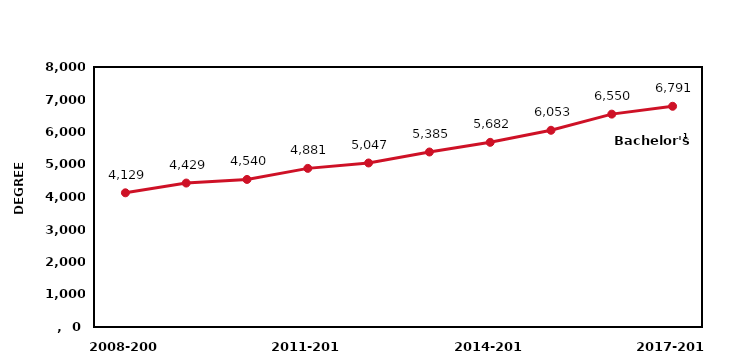
| Category | Bachelor's |
|---|---|
| 2008-2009 | 4129 |
| 2009-2010 | 4429 |
| 2010-2011 | 4540 |
| 2011-2012 | 4881 |
| 2012-2013 | 5047 |
| 2013-2014 | 5385 |
| 2014-2015 | 5682 |
| 2015-2016 | 6053 |
| 2016-2017 | 6550 |
| 2017-2018 | 6791 |